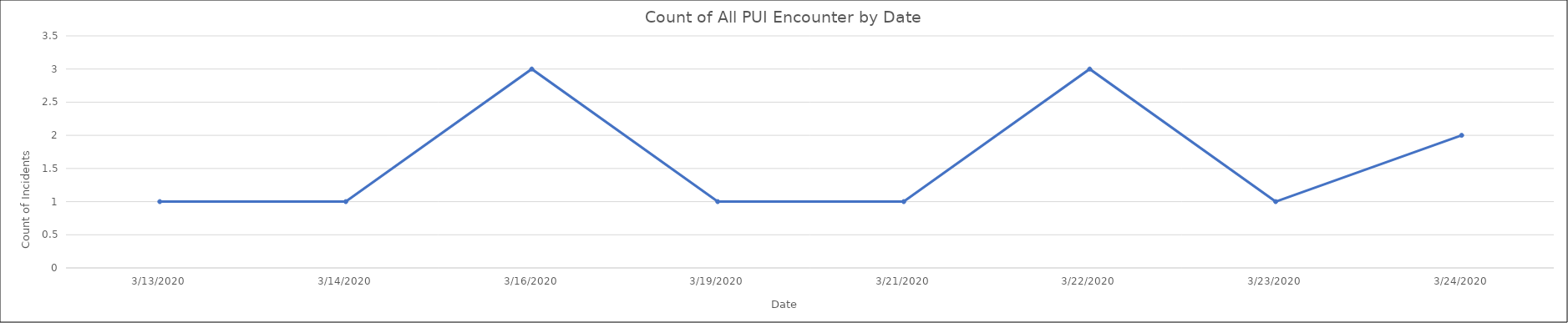
| Category | Total |
|---|---|
| 3/13/2020 | 1 |
| 3/14/2020 | 1 |
| 3/16/2020 | 3 |
| 3/19/2020 | 1 |
| 3/21/2020 | 1 |
| 3/22/2020 | 3 |
| 3/23/2020 | 1 |
| 3/24/2020 | 2 |